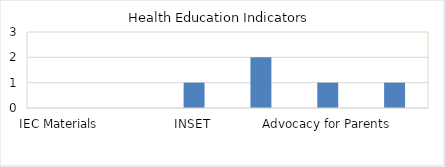
| Category | Series 0 |
|---|---|
| IEC Materials | 0 |
| Organized Teams  | 0 |
| INSET | 1 |
| Learning Materials | 2 |
| Advocacy for Parents | 1 |
| Extra Curricular Activities | 1 |